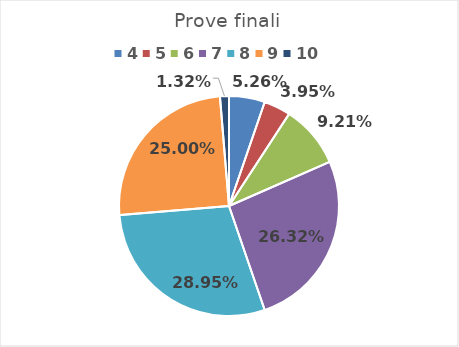
| Category | Series 0 |
|---|---|
| 4.0 | 0.053 |
| 5.0 | 0.039 |
| 6.0 | 0.092 |
| 7.0 | 0.263 |
| 8.0 | 0.289 |
| 9.0 | 0.25 |
| 10.0 | 0.013 |